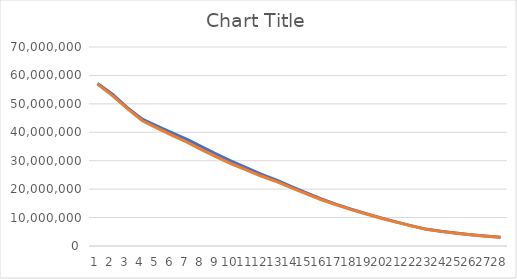
| Category | Series 0 | Series 1 |
|---|---|---|
| 0 | 57189144 | 56944519 |
| 1 | 53377825 | 52905144 |
| 2 | 48692095 | 48306209 |
| 3 | 44621159 | 44062212 |
| 4 | 42147318 | 41441506 |
| 5 | 39756288 | 38893574 |
| 6 | 37489486 | 36491645 |
| 7 | 34878737 | 33801018 |
| 8 | 32264430 | 31231324 |
| 9 | 29777136 | 28841787 |
| 10 | 27445976 | 26668227 |
| 11 | 25175286 | 24523838 |
| 12 | 23168256 | 22625592 |
| 13 | 20899931 | 20461573 |
| 14 | 18710661 | 18366041 |
| 15 | 16546085 | 16267008 |
| 16 | 14654625 | 14487824 |
| 17 | 12944647 | 12799423 |
| 18 | 11403025 | 11267576 |
| 19 | 9896827 | 9776759 |
| 20 | 8485074 | 8380972 |
| 21 | 7167193 | 7078296 |
| 22 | 5949442 | 5874851 |
| 23 | 5204717 | 5146143 |
| 24 | 4533235 | 4488553 |
| 25 | 3956103 | 3923159 |
| 26 | 3484712 | 3461055 |
| 27 | 3113714 | 3097227 |